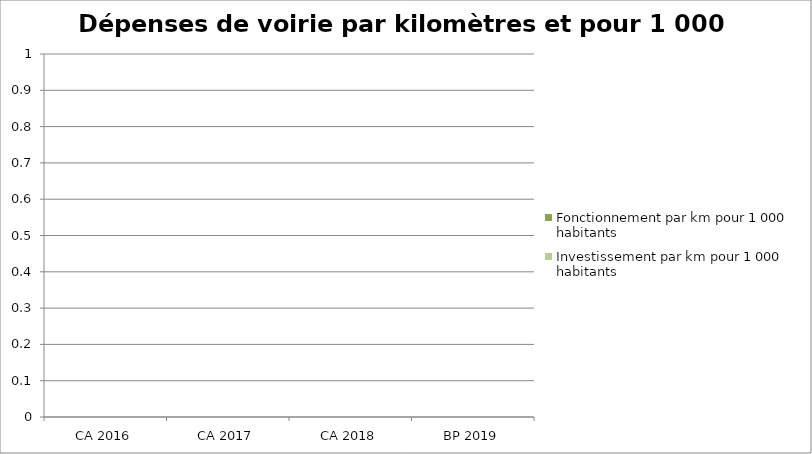
| Category | Fonctionnement par km pour 1 000 habitants | Investissement par km pour 1 000 habitants |
|---|---|---|
| CA 2016 | 0 | 0 |
| CA 2017 | 0 | 0 |
| CA 2018 | 0 | 0 |
| BP 2019 | 0 | 0 |